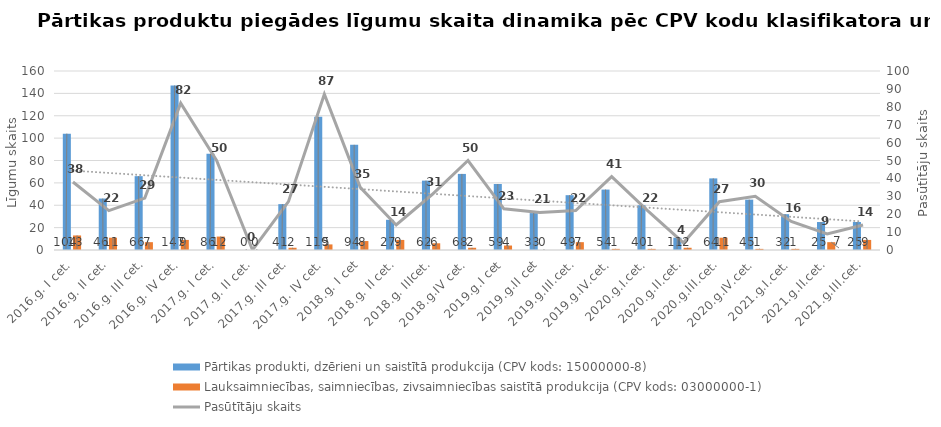
| Category | Pārtikas produkti, dzērieni un saistītā produkcija (CPV kods: 15000000-8) | Lauksaimniecības, saimniecības, zivsaimniecības saistītā produkcija (CPV kods: 03000000-1) |
|---|---|---|
| 2016.g. I cet. | 104 | 13 |
| 2016.g. II cet. | 46 | 11 |
| 2016.g. III cet. | 66 | 7 |
| 2016.g. IV cet. | 147 | 9 |
| 2017.g. I cet. | 86 | 12 |
| 2017.g. II cet. | 0 | 0 |
| 2017.g. III cet. | 41 | 2 |
| 2017.g. IV cet. | 119 | 5 |
| 2018.g. I cet | 94 | 8 |
| 2018.g. II cet. | 27 | 9 |
| 2018.g. IIIcet. | 62 | 6 |
| 2018.g.IV cet. | 68 | 2 |
| 2019.g.I cet | 59 | 4 |
| 2019.g.II cet | 33 | 0 |
| 2019.g.III.cet. | 49 | 7 |
| 2019.g.IV.cet. | 54 | 1 |
| 2020.g.I.cet. | 40 | 1 |
| 2020.g.II.cet. | 11 | 2 |
| 2020.g.III.cet. | 64 | 11 |
| 2020.g.IV.cet. | 45 | 1 |
| 2021.g.I.cet. | 32 | 1 |
| 2021.g.II.cet. | 25 | 7 |
| 2021.g.III.cet. | 25 | 9 |